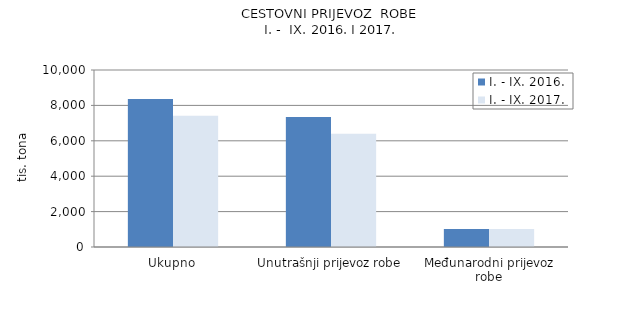
| Category | I. - IX. 2016. | I. - IX. 2017. |
|---|---|---|
| Ukupno | 8359 | 7409 |
| Unutrašnji prijevoz robe | 7348 | 6398 |
| Međunarodni prijevoz robe | 1011 | 1011 |